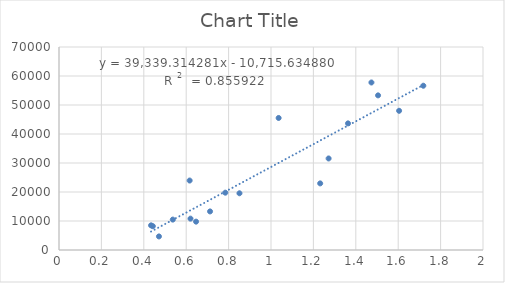
| Category | Series 0 |
|---|---|
| 1.232 | 22971 |
| 1.27175 | 31562 |
| 1.36325 | 43665 |
| 1.505 | 53323 |
| 1.60425 | 48000 |
| 1.7185 | 56644 |
| 1.47375 | 57763 |
| 1.036 | 45527 |
| 0.61625 | 23953 |
| 0.4425 | 8217 |
| 0.4715 | 4679 |
| 0.43425 | 8499 |
| 0.53675 | 10486 |
| 0.62025 | 10812 |
| 0.6465 | 9778 |
| 0.7125 | 13302 |
| 0.7845 | 19763 |
| 0.85125 | 19561 |